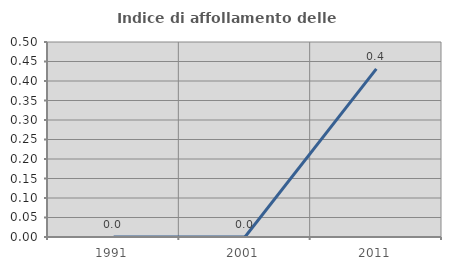
| Category | Indice di affollamento delle abitazioni  |
|---|---|
| 1991.0 | 0 |
| 2001.0 | 0 |
| 2011.0 | 0.431 |